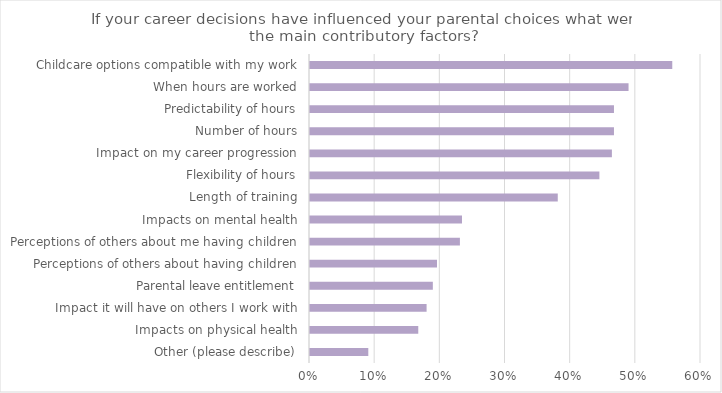
| Category | Series 0 |
|---|---|
| Other (please describe) | 0.089 |
| Impacts on physical health | 0.166 |
| Impact it will have on others I work with | 0.179 |
| Parental leave entitlement | 0.188 |
| Perceptions of others about having children | 0.195 |
| Perceptions of others about me having children | 0.23 |
| Impacts on mental health | 0.233 |
| Length of training | 0.38 |
| Flexibility of hours | 0.444 |
| Impact on my career progression | 0.463 |
| Number of hours | 0.466 |
| Predictability of hours | 0.466 |
| When hours are worked | 0.489 |
| Childcare options compatible with my work | 0.556 |